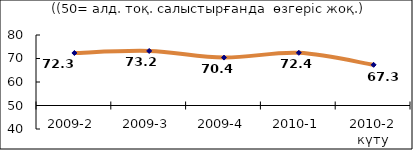
| Category | Диф.индекс ↓ |
|---|---|
| 2009-2 | 72.345 |
| 2009-3 | 73.205 |
| 2009-4 | 70.39 |
| 2010-1 | 72.43 |
| 2010-2 күту | 67.305 |